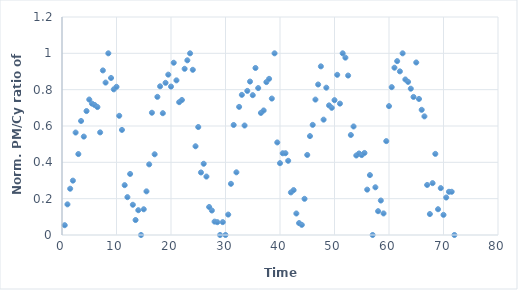
| Category | Norm. P/C Ratio |
|---|---|
| 0.5 | 0.054 |
| 1.0 | 0.169 |
| 1.5 | 0.255 |
| 2.0 | 0.299 |
| 2.5 | 0.564 |
| 3.0 | 0.446 |
| 3.5 | 0.628 |
| 4.0 | 0.542 |
| 4.5 | 0.682 |
| 5.0 | 0.746 |
| 5.5 | 0.723 |
| 6.0 | 0.716 |
| 6.5 | 0.704 |
| 7.0 | 0.565 |
| 7.5 | 0.906 |
| 8.0 | 0.839 |
| 8.5 | 1 |
| 9.0 | 0.864 |
| 9.5 | 0.802 |
| 10.0 | 0.816 |
| 10.5 | 0.656 |
| 11.0 | 0.578 |
| 11.5 | 0.274 |
| 12.0 | 0.208 |
| 12.5 | 0.336 |
| 13.0 | 0.166 |
| 13.5 | 0.082 |
| 14.0 | 0.136 |
| 14.5 | 0 |
| 15.0 | 0.142 |
| 15.5 | 0.24 |
| 16.0 | 0.389 |
| 16.5 | 0.673 |
| 17.0 | 0.444 |
| 17.5 | 0.76 |
| 18.0 | 0.818 |
| 18.5 | 0.67 |
| 19.0 | 0.838 |
| 19.5 | 0.883 |
| 20.0 | 0.817 |
| 20.5 | 0.948 |
| 21.0 | 0.851 |
| 21.5 | 0.731 |
| 22.0 | 0.743 |
| 22.5 | 0.915 |
| 23.0 | 0.962 |
| 23.5 | 1 |
| 24.0 | 0.909 |
| 24.5 | 0.488 |
| 25.0 | 0.594 |
| 25.5 | 0.344 |
| 26.0 | 0.392 |
| 26.5 | 0.322 |
| 27.0 | 0.154 |
| 27.5 | 0.135 |
| 28.0 | 0.074 |
| 28.5 | 0.071 |
| 29.0 | 0 |
| 29.5 | 0.071 |
| 30.0 | 0 |
| 30.5 | 0.112 |
| 31.0 | 0.282 |
| 31.5 | 0.606 |
| 32.0 | 0.345 |
| 32.5 | 0.705 |
| 33.0 | 0.771 |
| 33.5 | 0.603 |
| 34.0 | 0.793 |
| 34.5 | 0.845 |
| 35.0 | 0.77 |
| 35.5 | 0.919 |
| 36.0 | 0.809 |
| 36.5 | 0.672 |
| 37.0 | 0.686 |
| 37.5 | 0.842 |
| 38.0 | 0.86 |
| 38.5 | 0.751 |
| 39.0 | 1 |
| 39.5 | 0.509 |
| 40.0 | 0.395 |
| 40.5 | 0.45 |
| 41.0 | 0.45 |
| 41.5 | 0.408 |
| 42.0 | 0.234 |
| 42.5 | 0.247 |
| 43.0 | 0.118 |
| 43.5 | 0.066 |
| 44.0 | 0.056 |
| 44.5 | 0.199 |
| 45.0 | 0.441 |
| 45.5 | 0.544 |
| 46.0 | 0.606 |
| 46.5 | 0.745 |
| 47.0 | 0.828 |
| 47.5 | 0.928 |
| 48.0 | 0.635 |
| 48.5 | 0.811 |
| 49.0 | 0.714 |
| 49.5 | 0.7 |
| 50.0 | 0.742 |
| 50.5 | 0.882 |
| 51.0 | 0.723 |
| 51.5 | 1 |
| 52.0 | 0.976 |
| 52.5 | 0.878 |
| 53.0 | 0.55 |
| 53.5 | 0.597 |
| 54.0 | 0.438 |
| 54.5 | 0.449 |
| 55.0 | 0.44 |
| 55.5 | 0.452 |
| 56.0 | 0.25 |
| 56.5 | 0.33 |
| 57.0 | 0 |
| 57.5 | 0.262 |
| 58.0 | 0.131 |
| 58.5 | 0.19 |
| 59.0 | 0.119 |
| 59.5 | 0.517 |
| 60.0 | 0.709 |
| 60.5 | 0.814 |
| 61.0 | 0.921 |
| 61.5 | 0.957 |
| 62.0 | 0.901 |
| 62.5 | 1 |
| 63.0 | 0.856 |
| 63.5 | 0.843 |
| 64.0 | 0.805 |
| 64.5 | 0.76 |
| 65.0 | 0.95 |
| 65.5 | 0.749 |
| 66.0 | 0.689 |
| 66.5 | 0.653 |
| 67.0 | 0.275 |
| 67.5 | 0.115 |
| 68.0 | 0.285 |
| 68.5 | 0.446 |
| 69.0 | 0.142 |
| 69.5 | 0.258 |
| 70.0 | 0.111 |
| 70.5 | 0.206 |
| 71.0 | 0.238 |
| 71.5 | 0.238 |
| 72.0 | 0 |